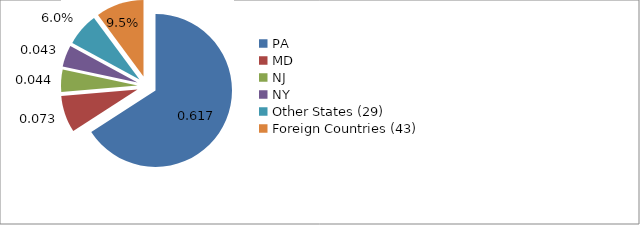
| Category | Series 1 |
|---|---|
| PA | 0.617 |
| MD | 0.073 |
| NJ | 0.044 |
| NY | 0.043 |
| Other States (29)  | 0.065 |
| Foreign Countries (43) | 0.095 |